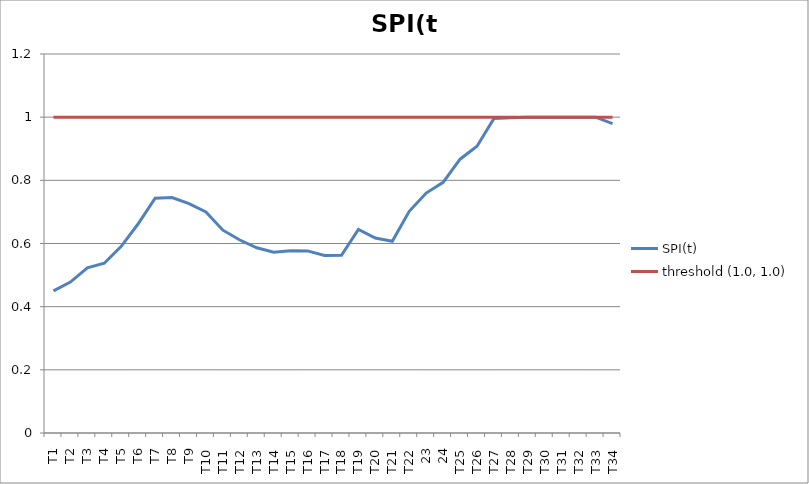
| Category | SPI(t) | threshold (1.0, 1.0) |
|---|---|---|
| T1 | 0.45 | 1 |
| T2 | 0.478 | 1 |
| T3 | 0.523 | 1 |
| T4 | 0.538 | 1 |
| T5 | 0.591 | 1 |
| T6 | 0.662 | 1 |
| T7 | 0.743 | 1 |
| T8 | 0.746 | 1 |
| T9 | 0.726 | 1 |
| T10 | 0.7 | 1 |
| T11 | 0.642 | 1 |
| T12 | 0.611 | 1 |
| T13 | 0.586 | 1 |
| T14 | 0.573 | 1 |
| T15 | 0.577 | 1 |
| T16 | 0.577 | 1 |
| T17 | 0.562 | 1 |
| T18 | 0.562 | 1 |
| T19 | 0.645 | 1 |
| T20 | 0.618 | 1 |
| T21 | 0.607 | 1 |
| T22 | 0.702 | 1 |
| 23 | 0.76 | 1 |
| 24 | 0.794 | 1 |
| T25 | 0.867 | 1 |
| T26 | 0.908 | 1 |
| T27 | 0.996 | 1 |
| T28 | 0.998 | 1 |
| T29 | 1 | 1 |
| T30 | 1 | 1 |
| T31 | 1 | 1 |
| T32 | 1 | 1 |
| T33 | 1 | 1 |
| T34 | 0.98 | 1 |